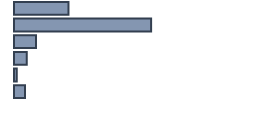
| Category | Percentatge |
|---|---|
| 0 | 22.696 |
| 1 | 57.13 |
| 2 | 9.13 |
| 3 | 5.348 |
| 4 | 1.13 |
| 5 | 4.565 |